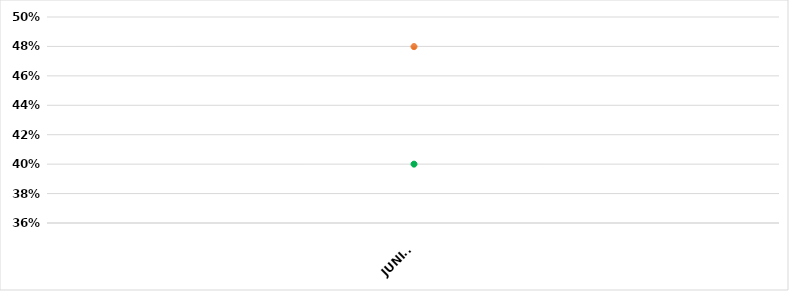
| Category | VALOR  | META PONDERADA |
|---|---|---|
| JUNIO | 0.48 | 0.4 |